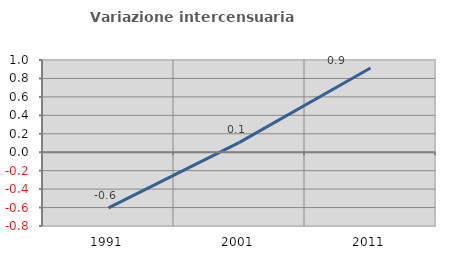
| Category | Variazione intercensuaria annua |
|---|---|
| 1991.0 | -0.603 |
| 2001.0 | 0.106 |
| 2011.0 | 0.914 |